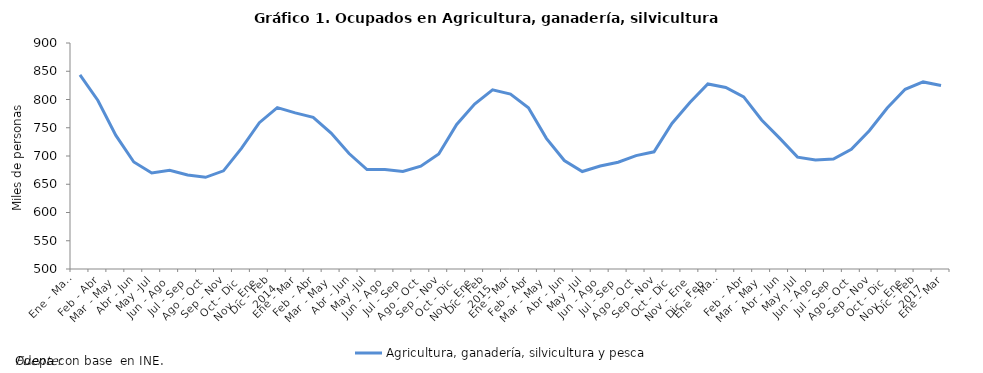
| Category | Agricultura, ganadería, silvicultura y pesca |
|---|---|
| 0 | 843.658 |
| 1 | 798.266 |
| 2 | 736.461 |
| 3 | 689.358 |
| 4 | 669.839 |
| 5 | 674.791 |
| 6 | 666.406 |
| 7 | 662.262 |
| 8 | 673.724 |
| 9 | 713.604 |
| 10 | 758.988 |
| 11 | 785.537 |
| 12 | 776.373 |
| 13 | 768.303 |
| 14 | 740.609 |
| 15 | 704.367 |
| 16 | 675.938 |
| 17 | 676.058 |
| 18 | 672.6 |
| 19 | 682.074 |
| 20 | 703.599 |
| 21 | 755.905 |
| 22 | 791.902 |
| 23 | 817.027 |
| 24 | 809.646 |
| 25 | 785.301 |
| 26 | 731.282 |
| 27 | 691.978 |
| 28 | 672.526 |
| 29 | 682.164 |
| 30 | 689.034 |
| 31 | 700.719 |
| 32 | 707.439 |
| 33 | 757.522 |
| 34 | 794.669 |
| 35 | 827.605 |
| 36 | 821.367 |
| 37 | 804.582 |
| 38 | 763.826 |
| 39 | 731.558 |
| 40 | 698.04 |
| 41 | 692.989 |
| 42 | 694.776 |
| 43 | 711.757 |
| 44 | 744.739 |
| 45 | 785.03 |
| 46 | 818.051 |
| 47 | 831.11 |
| 48 | 824.789 |